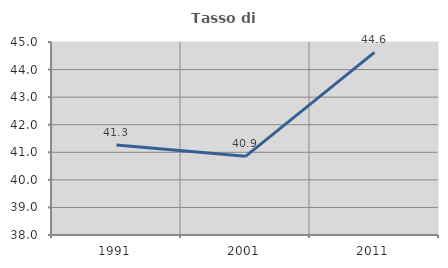
| Category | Tasso di occupazione   |
|---|---|
| 1991.0 | 41.266 |
| 2001.0 | 40.854 |
| 2011.0 | 44.623 |